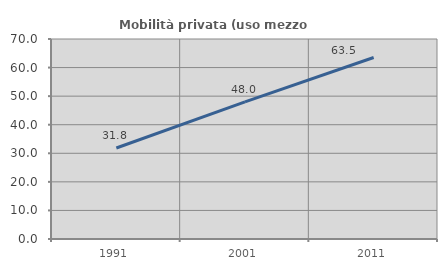
| Category | Mobilità privata (uso mezzo privato) |
|---|---|
| 1991.0 | 31.847 |
| 2001.0 | 47.988 |
| 2011.0 | 63.536 |